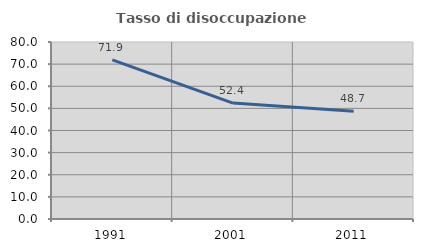
| Category | Tasso di disoccupazione giovanile  |
|---|---|
| 1991.0 | 71.903 |
| 2001.0 | 52.381 |
| 2011.0 | 48.667 |